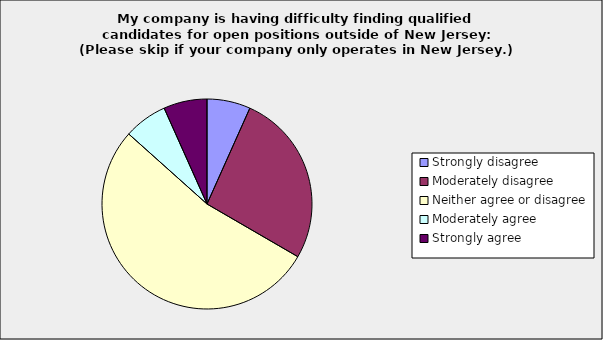
| Category | Series 0 |
|---|---|
| Strongly disagree | 0.067 |
| Moderately disagree | 0.267 |
| Neither agree or disagree | 0.533 |
| Moderately agree | 0.067 |
| Strongly agree | 0.067 |